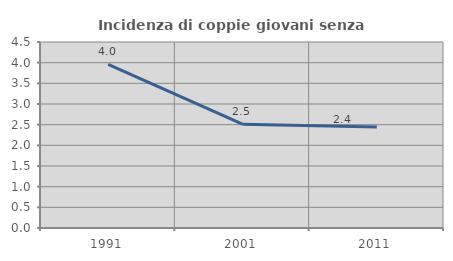
| Category | Incidenza di coppie giovani senza figli |
|---|---|
| 1991.0 | 3.96 |
| 2001.0 | 2.513 |
| 2011.0 | 2.446 |